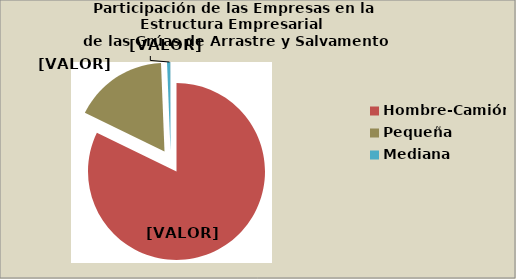
| Category | Series 0 |
|---|---|
| Hombre-Camión | 82.235 |
| Pequeña | 17.188 |
| Mediana | 0.6 |
| Grande | 0.03 |